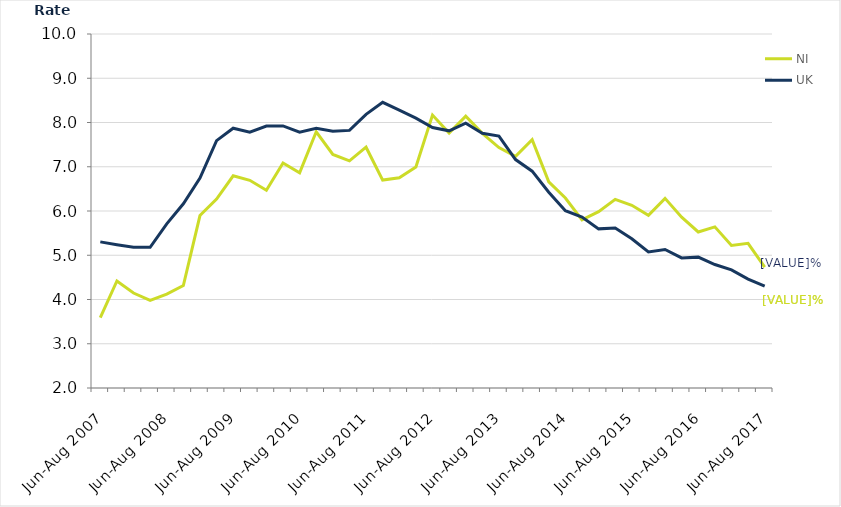
| Category | NI | UK |
|---|---|---|
| Jun-Aug 2007 | 3.589 | 5.302 |
| Sep-Nov 2007 | 4.419 | 5.239 |
| Dec-Feb 2008 | 4.146 | 5.181 |
| Mar-May 2008 | 3.979 | 5.179 |
| Jun-Aug 2008 | 4.122 | 5.71 |
| Sep-Nov 2008 | 4.317 | 6.163 |
| Dec-Feb 2009 | 5.897 | 6.744 |
| Mar-May 2009 | 6.27 | 7.59 |
| Jun-Aug 2009 | 6.796 | 7.87 |
| Sep-Nov 2009 | 6.693 | 7.781 |
| Dec-Feb 2010 | 6.47 | 7.92 |
| Mar-May 2010 | 7.085 | 7.923 |
| Jun-Aug 2010 | 6.862 | 7.782 |
| Sep-Nov 2010 | 7.791 | 7.871 |
| Dec-Feb 2011 | 7.277 | 7.803 |
| Mar-May 2011 | 7.133 | 7.822 |
| Jun-Aug 2011 | 7.442 | 8.185 |
| Sep-Nov 2011 | 6.699 | 8.455 |
| Dec-Feb 2012 | 6.75 | 8.279 |
| Mar-May 2012 | 6.993 | 8.098 |
| Jun-Aug 2012 | 8.168 | 7.888 |
| Sep-Nov 2012 | 7.762 | 7.812 |
| Dec-Feb 2013 | 8.142 | 7.984 |
| Mar-May 2013 | 7.756 | 7.757 |
| Jun-Aug 2013 | 7.434 | 7.692 |
| Sep-Nov 2013 | 7.236 | 7.162 |
| Dec-Feb 2014 | 7.609 | 6.9 |
| Mar-May 2014 | 6.657 | 6.425 |
| Jun-Aug 2014 | 6.294 | 6.007 |
| Sep-Nov 2014 | 5.801 | 5.864 |
| Dec-Feb 2015 | 5.986 | 5.596 |
| Mar-May 2015 | 6.263 | 5.615 |
| Jun-Aug 2015 | 6.129 | 5.371 |
| Sep-Nov 2015 | 5.902 | 5.074 |
| Dec-Feb 2016 | 6.285 | 5.13 |
| Mar-May 2016 | 5.859 | 4.94 |
| Jun-Aug 2016 | 5.526 | 4.957 |
| Sep-Nov 2016 | 5.642 | 4.79 |
| Dec-Feb 2017 | 5.222 | 4.668 |
| Mar-May 2017 | 5.269 | 4.461 |
| Jun-Aug 2017 | 4.729 | 4.301 |